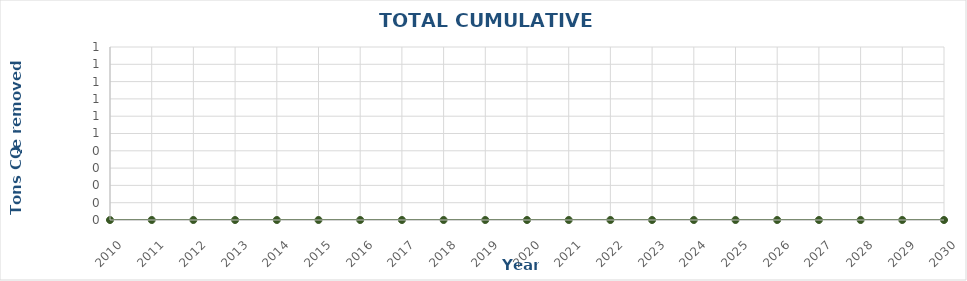
| Category | All FLR activities |
|---|---|
| 2010.0 | 0 |
| 2011.0 | 0 |
| 2012.0 | 0 |
| 2013.0 | 0 |
| 2014.0 | 0 |
| 2015.0 | 0 |
| 2016.0 | 0 |
| 2017.0 | 0 |
| 2018.0 | 0 |
| 2019.0 | 0 |
| 2020.0 | 0 |
| 2021.0 | 0 |
| 2022.0 | 0 |
| 2023.0 | 0 |
| 2024.0 | 0 |
| 2025.0 | 0 |
| 2026.0 | 0 |
| 2027.0 | 0 |
| 2028.0 | 0 |
| 2029.0 | 0 |
| 2030.0 | 0 |